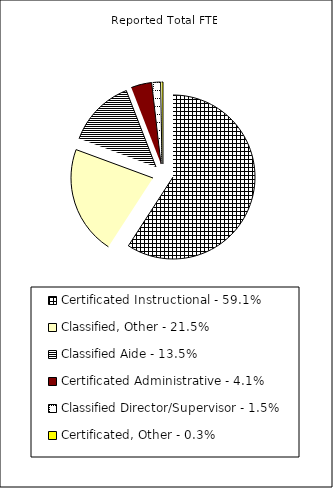
| Category | Reported FTE |
|---|---|
| Certificated Instructional - 59.1% | 73288.59 |
| Classified, Other - 21.5% | 26599.13 |
| Classified Aide - 13.5% | 16693.9 |
| Certificated Administrative - 4.1% | 5052 |
| Classified Director/Supervisor - 1.5% | 1922.12 |
| Certificated, Other - 0.3% | 336.19 |